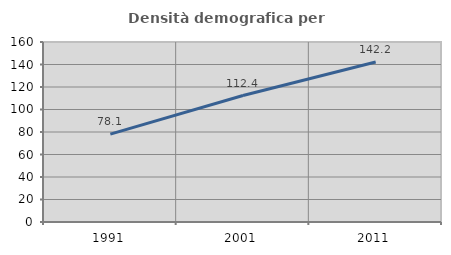
| Category | Densità demografica |
|---|---|
| 1991.0 | 78.091 |
| 2001.0 | 112.41 |
| 2011.0 | 142.208 |